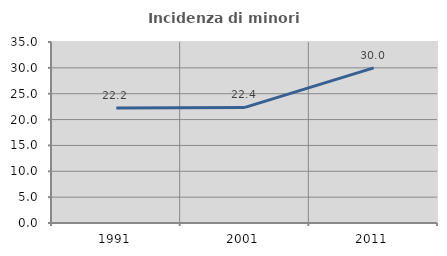
| Category | Incidenza di minori stranieri |
|---|---|
| 1991.0 | 22.222 |
| 2001.0 | 22.353 |
| 2011.0 | 30 |